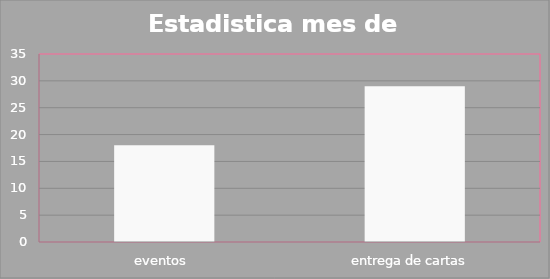
| Category | Series 0 |
|---|---|
| eventos  | 18 |
| entrega de cartas  | 29 |